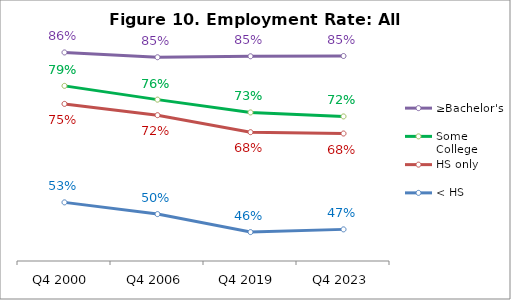
| Category | ≥Bachelor's | Some College | HS only | < HS |
|---|---|---|---|---|
| Q4 2000 | 0.861 | 0.787 | 0.748 | 0.53 |
| Q4 2006 | 0.851 | 0.757 | 0.723 | 0.504 |
| Q4 2019 | 0.853 | 0.729 | 0.685 | 0.464 |
| Q4 2023 | 0.854 | 0.72 | 0.682 | 0.47 |